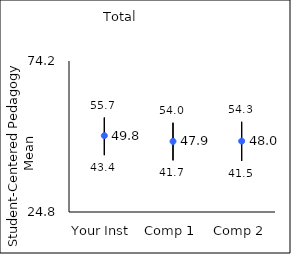
| Category | 25th percentile | 75th percentile | Mean |
|---|---|---|---|
| Your Inst | 43.4 | 55.7 | 49.77 |
| Comp 1 | 41.7 | 54 | 47.9 |
| Comp 2 | 41.5 | 54.3 | 47.98 |